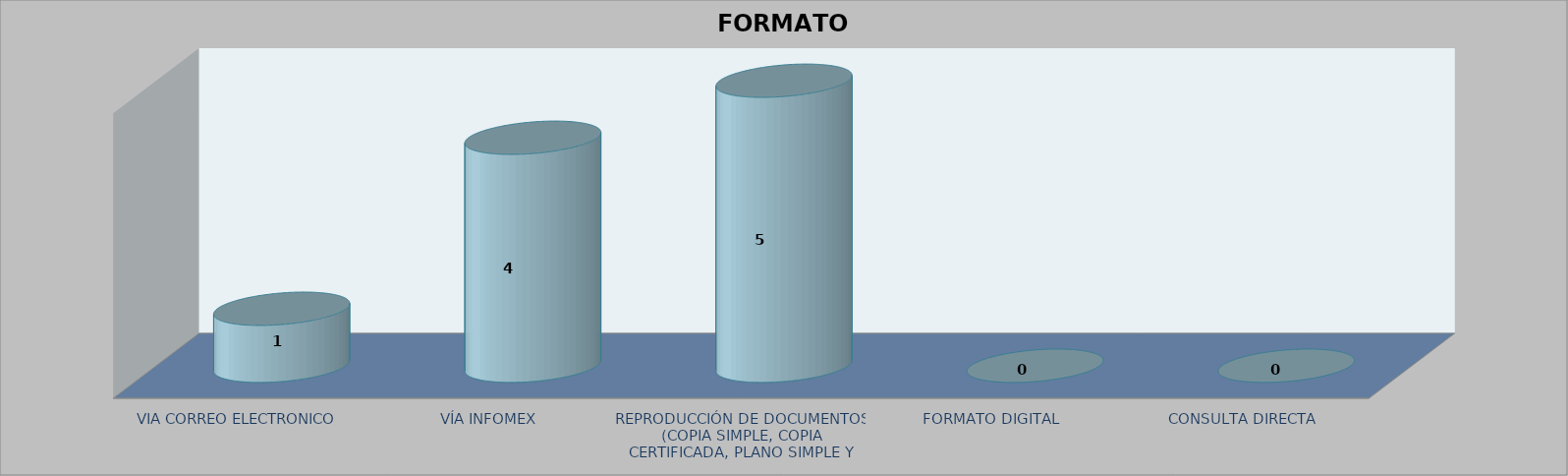
| Category |        FORMATO SOLICITADO | Series 1 | Series 2 |
|---|---|---|---|
| VIA CORREO ELECTRONICO |  |  | 1 |
| VÍA INFOMEX |  |  | 4 |
| REPRODUCCIÓN DE DOCUMENTOS (COPIA SIMPLE, COPIA CERTIFICADA, PLANO SIMPLE Y PLANO CERTIFICADO) |  |  | 5 |
| FORMATO DIGITAL |  |  | 0 |
| CONSULTA DIRECTA |  |  | 0 |